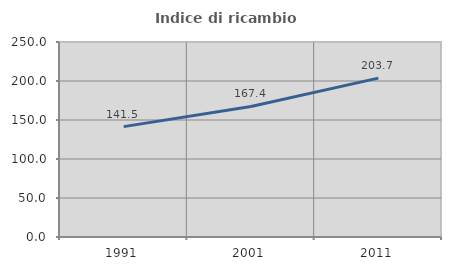
| Category | Indice di ricambio occupazionale  |
|---|---|
| 1991.0 | 141.497 |
| 2001.0 | 167.376 |
| 2011.0 | 203.681 |